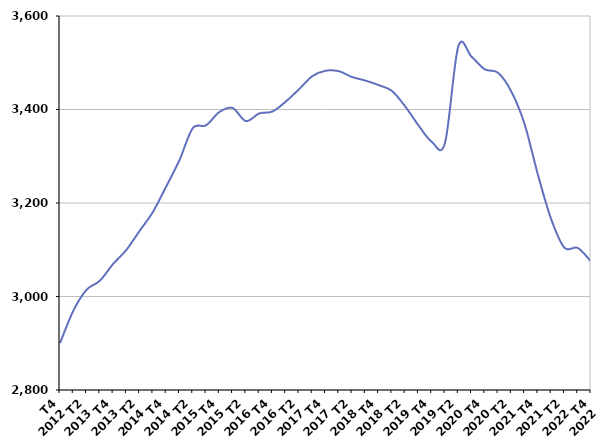
| Category | De 25 à 49 ans |
|---|---|
| T4
2012 | 2900.1 |
| T1
2013 | 2969.4 |
| T2
2013 | 3014.3 |
| T3
2013 | 3033.7 |
| T4
2013 | 3069.5 |
| T1
2014 | 3099.7 |
| T2
2014 | 3140.6 |
| T3
2014 | 3180.9 |
| T4
2014 | 3235.3 |
| T1
2015 | 3291.8 |
| T2
2015 | 3360.1 |
| T3
2015 | 3366.2 |
| T4
2015 | 3394.5 |
| T1
2016 | 3403.3 |
| T2
2016 | 3375.2 |
| T3
2016 | 3391.6 |
| T4
2016 | 3395.6 |
| T1
2017 | 3416.8 |
| T2
2017 | 3443.1 |
| T3
2017 | 3471.2 |
| T4
2017 | 3482.8 |
| T1
2018 | 3482 |
| T2
2018 | 3469.5 |
| T3
2018 | 3461.9 |
| T4
2018 | 3452.2 |
| T1
2019 | 3439.8 |
| T2
2019 | 3406.7 |
| T3
2019 | 3366.3 |
| T4
2019 | 3331.1 |
| T1
2020 | 3328.6 |
| T2
2020 | 3534.5 |
| T3
2020 | 3513 |
| T4
2020 | 3485.9 |
| T1
2021 | 3478.6 |
| T2
2021 | 3438.3 |
| T3
2021 | 3368.4 |
| T4
2021 | 3260.6 |
| T1
2022 | 3165.5 |
| T2
2022 | 3104.4 |
| T3
2022 | 3103.9 |
| T4
2022 | 3074.9 |